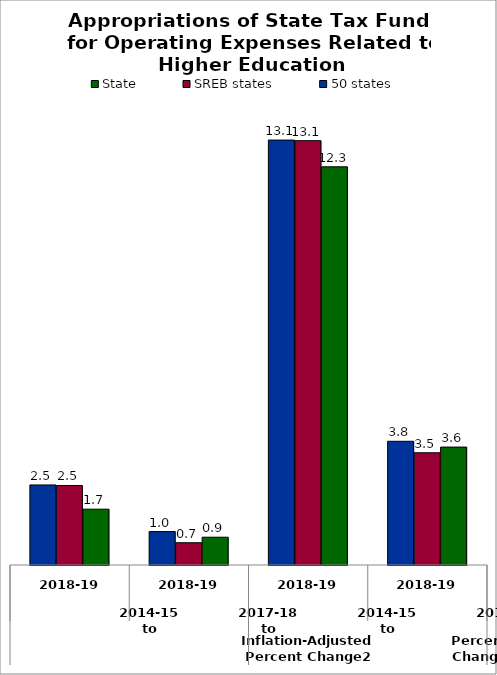
| Category | State | SREB states | 50 states |
|---|---|---|---|
| 0 | 3.644 | 3.469 | 3.824 |
| 1 | 12.306 | 13.114 | 13.132 |
| 2 | 0.859 | 0.688 | 1.034 |
| 3 | 1.726 | 2.457 | 2.474 |